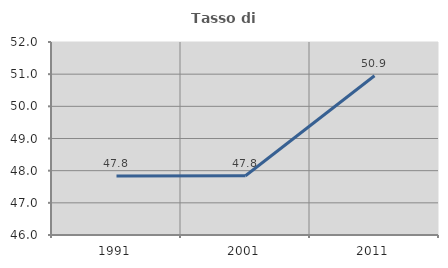
| Category | Tasso di occupazione   |
|---|---|
| 1991.0 | 47.835 |
| 2001.0 | 47.842 |
| 2011.0 | 50.95 |